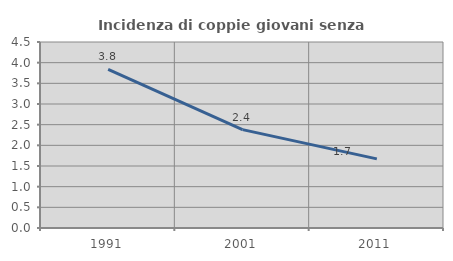
| Category | Incidenza di coppie giovani senza figli |
|---|---|
| 1991.0 | 3.838 |
| 2001.0 | 2.379 |
| 2011.0 | 1.672 |